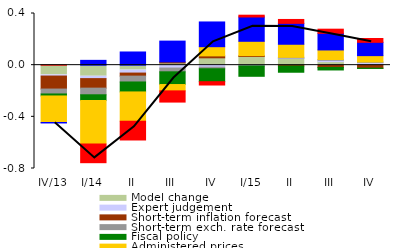
| Category | Model change | Expert judgement | Short-term inflation forecast  | Short-term exch. rate forecast  | Fiscal policy | Administered prices | Foreign environment | Initial state |
|---|---|---|---|---|---|---|---|---|
| IV/13 | -0.075 | -0.009 | -0.101 | -0.038 | -0.015 | -0.206 | -0.003 | 0.002 |
| I/14 | -0.086 | -0.018 | -0.074 | -0.051 | -0.045 | -0.336 | 0.037 | -0.145 |
| II | -0.038 | -0.023 | -0.024 | -0.045 | -0.077 | -0.227 | 0.102 | -0.145 |
| III | 0.017 | -0.022 | 0.008 | -0.029 | -0.098 | -0.049 | 0.161 | -0.087 |
| IV | 0.057 | -0.015 | 0.015 | -0.012 | -0.1 | 0.071 | 0.191 | -0.026 |
| I/15 | 0.067 | -0.006 | 0.006 | 0 | -0.08 | 0.111 | 0.188 | 0.014 |
| II | 0.051 | 0.004 | -0.007 | 0.006 | -0.048 | 0.101 | 0.162 | 0.03 |
| III | 0.027 | 0.011 | -0.017 | 0.006 | -0.02 | 0.074 | 0.129 | 0.032 |
| IV | 0.006 | 0.015 | -0.023 | 0.003 | -0.002 | 0.049 | 0.103 | 0.03 |